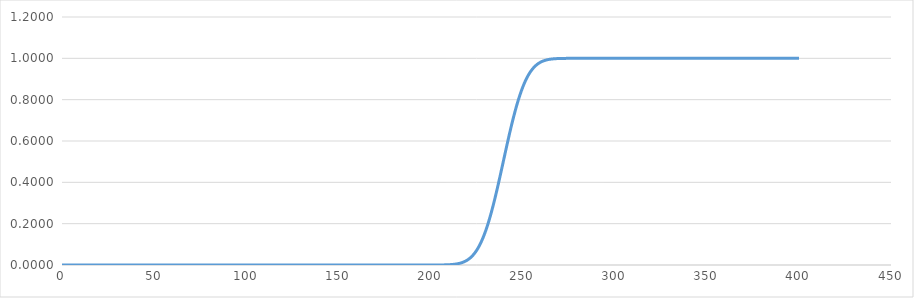
| Category | Series 0 |
|---|---|
| 0.0 | 0 |
| 1.0 | 0 |
| 2.0 | 0 |
| 3.0 | 0 |
| 4.0 | 0 |
| 5.0 | 0 |
| 6.0 | 0 |
| 7.0 | 0 |
| 8.0 | 0 |
| 9.0 | 0 |
| 10.0 | 0 |
| 11.0 | 0 |
| 12.0 | 0 |
| 13.0 | 0 |
| 14.0 | 0 |
| 15.0 | 0 |
| 16.0 | 0 |
| 17.0 | 0 |
| 18.0 | 0 |
| 19.0 | 0 |
| 20.0 | 0 |
| 21.0 | 0 |
| 22.0 | 0 |
| 23.0 | 0 |
| 24.0 | 0 |
| 25.0 | 0 |
| 26.0 | 0 |
| 27.0 | 0 |
| 28.0 | 0 |
| 29.0 | 0 |
| 30.0 | 0 |
| 31.0 | 0 |
| 32.0 | 0 |
| 33.0 | 0 |
| 34.0 | 0 |
| 35.0 | 0 |
| 36.0 | 0 |
| 37.0 | 0 |
| 38.0 | 0 |
| 39.0 | 0 |
| 40.0 | 0 |
| 41.0 | 0 |
| 42.0 | 0 |
| 43.0 | 0 |
| 44.0 | 0 |
| 45.0 | 0 |
| 46.0 | 0 |
| 47.0 | 0 |
| 48.0 | 0 |
| 49.0 | 0 |
| 50.0 | 0 |
| 51.0 | 0 |
| 52.0 | 0 |
| 53.0 | 0 |
| 54.0 | 0 |
| 55.0 | 0 |
| 56.0 | 0 |
| 57.0 | 0 |
| 58.0 | 0 |
| 59.0 | 0 |
| 60.0 | 0 |
| 61.0 | 0 |
| 62.0 | 0 |
| 63.0 | 0 |
| 64.0 | 0 |
| 65.0 | 0 |
| 66.0 | 0 |
| 67.0 | 0 |
| 68.0 | 0 |
| 69.0 | 0 |
| 70.0 | 0 |
| 71.0 | 0 |
| 72.0 | 0 |
| 73.0 | 0 |
| 74.0 | 0 |
| 75.0 | 0 |
| 76.0 | 0 |
| 77.0 | 0 |
| 78.0 | 0 |
| 79.0 | 0 |
| 80.0 | 0 |
| 81.0 | 0 |
| 82.0 | 0 |
| 83.0 | 0 |
| 84.0 | 0 |
| 85.0 | 0 |
| 86.0 | 0 |
| 87.0 | 0 |
| 88.0 | 0 |
| 89.0 | 0 |
| 90.0 | 0 |
| 91.0 | 0 |
| 92.0 | 0 |
| 93.0 | 0 |
| 94.0 | 0 |
| 95.0 | 0 |
| 96.0 | 0 |
| 97.0 | 0 |
| 98.0 | 0 |
| 99.0 | 0 |
| 100.0 | 0 |
| 101.0 | 0 |
| 102.0 | 0 |
| 103.0 | 0 |
| 104.0 | 0 |
| 105.0 | 0 |
| 106.0 | 0 |
| 107.0 | 0 |
| 108.0 | 0 |
| 109.0 | 0 |
| 110.0 | 0 |
| 111.0 | 0 |
| 112.0 | 0 |
| 113.0 | 0 |
| 114.0 | 0 |
| 115.0 | 0 |
| 116.0 | 0 |
| 117.0 | 0 |
| 118.0 | 0 |
| 119.0 | 0 |
| 120.0 | 0 |
| 121.0 | 0 |
| 122.0 | 0 |
| 123.0 | 0 |
| 124.0 | 0 |
| 125.0 | 0 |
| 126.0 | 0 |
| 127.0 | 0 |
| 128.0 | 0 |
| 129.0 | 0 |
| 130.0 | 0 |
| 131.0 | 0 |
| 132.0 | 0 |
| 133.0 | 0 |
| 134.0 | 0 |
| 135.0 | 0 |
| 136.0 | 0 |
| 137.0 | 0 |
| 138.0 | 0 |
| 139.0 | 0 |
| 140.0 | 0 |
| 141.0 | 0 |
| 142.0 | 0 |
| 143.0 | 0 |
| 144.0 | 0 |
| 145.0 | 0 |
| 146.0 | 0 |
| 147.0 | 0 |
| 148.0 | 0 |
| 149.0 | 0 |
| 150.0 | 0 |
| 151.0 | 0 |
| 152.0 | 0 |
| 153.0 | 0 |
| 154.0 | 0 |
| 155.0 | 0 |
| 156.0 | 0 |
| 157.0 | 0 |
| 158.0 | 0 |
| 159.0 | 0 |
| 160.0 | 0 |
| 161.0 | 0 |
| 162.0 | 0 |
| 163.0 | 0 |
| 164.0 | 0 |
| 165.0 | 0 |
| 166.0 | 0 |
| 167.0 | 0 |
| 168.0 | 0 |
| 169.0 | 0 |
| 170.0 | 0 |
| 171.0 | 0 |
| 172.0 | 0 |
| 173.0 | 0 |
| 174.0 | 0 |
| 175.0 | 0 |
| 176.0 | 0 |
| 177.0 | 0 |
| 178.0 | 0 |
| 179.0 | 0 |
| 180.0 | 0 |
| 181.0 | 0 |
| 182.0 | 0 |
| 183.0 | 0 |
| 184.0 | 0 |
| 185.0 | 0 |
| 186.0 | 0 |
| 187.0 | 0 |
| 188.0 | 0 |
| 189.0 | 0 |
| 190.0 | 0 |
| 191.0 | 0 |
| 192.0 | 0 |
| 193.0 | 0 |
| 194.0 | 0 |
| 195.0 | 0 |
| 196.0 | 0 |
| 197.0 | 0 |
| 198.0 | 0 |
| 199.0 | 0 |
| 200.0 | 0 |
| 201.0 | 0 |
| 202.0 | 0 |
| 203.0 | 0 |
| 204.0 | 0 |
| 205.0 | 0 |
| 206.0 | 0 |
| 207.0 | 0.001 |
| 208.0 | 0.001 |
| 209.0 | 0.001 |
| 210.0 | 0.001 |
| 211.0 | 0.002 |
| 212.0 | 0.003 |
| 213.0 | 0.004 |
| 214.0 | 0.005 |
| 215.0 | 0.006 |
| 216.0 | 0.009 |
| 217.0 | 0.011 |
| 218.0 | 0.015 |
| 219.0 | 0.019 |
| 220.0 | 0.024 |
| 221.0 | 0.03 |
| 222.0 | 0.038 |
| 223.0 | 0.047 |
| 224.0 | 0.057 |
| 225.0 | 0.07 |
| 226.0 | 0.085 |
| 227.0 | 0.101 |
| 228.0 | 0.12 |
| 229.0 | 0.142 |
| 230.0 | 0.166 |
| 231.0 | 0.193 |
| 232.0 | 0.222 |
| 233.0 | 0.253 |
| 234.0 | 0.287 |
| 235.0 | 0.322 |
| 236.0 | 0.359 |
| 237.0 | 0.398 |
| 238.0 | 0.438 |
| 239.0 | 0.478 |
| 240.0 | 0.519 |
| 241.0 | 0.56 |
| 242.0 | 0.599 |
| 243.0 | 0.638 |
| 244.0 | 0.676 |
| 245.0 | 0.712 |
| 246.0 | 0.746 |
| 247.0 | 0.778 |
| 248.0 | 0.807 |
| 249.0 | 0.834 |
| 250.0 | 0.858 |
| 251.0 | 0.88 |
| 252.0 | 0.899 |
| 253.0 | 0.916 |
| 254.0 | 0.931 |
| 255.0 | 0.944 |
| 256.0 | 0.955 |
| 257.0 | 0.964 |
| 258.0 | 0.971 |
| 259.0 | 0.977 |
| 260.0 | 0.982 |
| 261.0 | 0.986 |
| 262.0 | 0.99 |
| 263.0 | 0.992 |
| 264.0 | 0.994 |
| 265.0 | 0.996 |
| 266.0 | 0.997 |
| 267.0 | 0.998 |
| 268.0 | 0.998 |
| 269.0 | 0.999 |
| 270.0 | 0.999 |
| 271.0 | 0.999 |
| 272.0 | 1 |
| 273.0 | 1 |
| 274.0 | 1 |
| 275.0 | 1 |
| 276.0 | 1 |
| 277.0 | 1 |
| 278.0 | 1 |
| 279.0 | 1 |
| 280.0 | 1 |
| 281.0 | 1 |
| 282.0 | 1 |
| 283.0 | 1 |
| 284.0 | 1 |
| 285.0 | 1 |
| 286.0 | 1 |
| 287.0 | 1 |
| 288.0 | 1 |
| 289.0 | 1 |
| 290.0 | 1 |
| 291.0 | 1 |
| 292.0 | 1 |
| 293.0 | 1 |
| 294.0 | 1 |
| 295.0 | 1 |
| 296.0 | 1 |
| 297.0 | 1 |
| 298.0 | 1 |
| 299.0 | 1 |
| 300.0 | 1 |
| 301.0 | 1 |
| 302.0 | 1 |
| 303.0 | 1 |
| 304.0 | 1 |
| 305.0 | 1 |
| 306.0 | 1 |
| 307.0 | 1 |
| 308.0 | 1 |
| 309.0 | 1 |
| 310.0 | 1 |
| 311.0 | 1 |
| 312.0 | 1 |
| 313.0 | 1 |
| 314.0 | 1 |
| 315.0 | 1 |
| 316.0 | 1 |
| 317.0 | 1 |
| 318.0 | 1 |
| 319.0 | 1 |
| 320.0 | 1 |
| 321.0 | 1 |
| 322.0 | 1 |
| 323.0 | 1 |
| 324.0 | 1 |
| 325.0 | 1 |
| 326.0 | 1 |
| 327.0 | 1 |
| 328.0 | 1 |
| 329.0 | 1 |
| 330.0 | 1 |
| 331.0 | 1 |
| 332.0 | 1 |
| 333.0 | 1 |
| 334.0 | 1 |
| 335.0 | 1 |
| 336.0 | 1 |
| 337.0 | 1 |
| 338.0 | 1 |
| 339.0 | 1 |
| 340.0 | 1 |
| 341.0 | 1 |
| 342.0 | 1 |
| 343.0 | 1 |
| 344.0 | 1 |
| 345.0 | 1 |
| 346.0 | 1 |
| 347.0 | 1 |
| 348.0 | 1 |
| 349.0 | 1 |
| 350.0 | 1 |
| 351.0 | 1 |
| 352.0 | 1 |
| 353.0 | 1 |
| 354.0 | 1 |
| 355.0 | 1 |
| 356.0 | 1 |
| 357.0 | 1 |
| 358.0 | 1 |
| 359.0 | 1 |
| 360.0 | 1 |
| 361.0 | 1 |
| 362.0 | 1 |
| 363.0 | 1 |
| 364.0 | 1 |
| 365.0 | 1 |
| 366.0 | 1 |
| 367.0 | 1 |
| 368.0 | 1 |
| 369.0 | 1 |
| 370.0 | 1 |
| 371.0 | 1 |
| 372.0 | 1 |
| 373.0 | 1 |
| 374.0 | 1 |
| 375.0 | 1 |
| 376.0 | 1 |
| 377.0 | 1 |
| 378.0 | 1 |
| 379.0 | 1 |
| 380.0 | 1 |
| 381.0 | 1 |
| 382.0 | 1 |
| 383.0 | 1 |
| 384.0 | 1 |
| 385.0 | 1 |
| 386.0 | 1 |
| 387.0 | 1 |
| 388.0 | 1 |
| 389.0 | 1 |
| 390.0 | 1 |
| 391.0 | 1 |
| 392.0 | 1 |
| 393.0 | 1 |
| 394.0 | 1 |
| 395.0 | 1 |
| 396.0 | 1 |
| 397.0 | 1 |
| 398.0 | 1 |
| 399.0 | 1 |
| 400.0 | 1 |